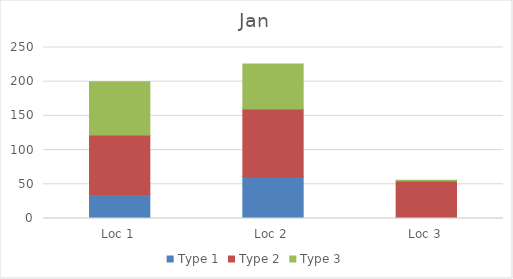
| Category | Type 1 | Type 2 | Type 3 |
|---|---|---|---|
| Loc 1 | 35 | 87 | 78 |
| Loc 2 | 61 | 99 | 66 |
| Loc 3 | 1 | 54 | 1 |